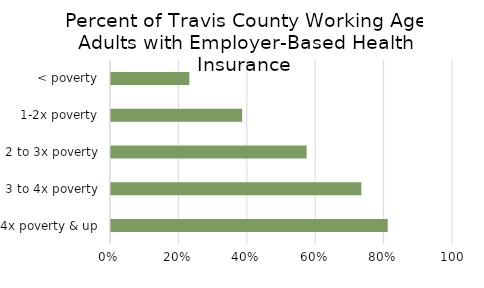
| Category | Series 0 | Series 1 | Series 2 |
|---|---|---|---|
| 4x poverty & up |  |  | 0.809 |
| 3 to 4x poverty |  |  | 0.732 |
| 2 to 3x poverty |  |  | 0.572 |
| 1-2x poverty |  |  | 0.384 |
| < poverty |  |  | 0.229 |